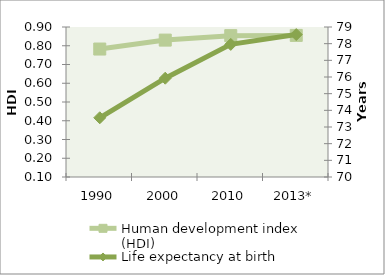
| Category | Human development index (HDI) |
|---|---|
| 1990 | 0.782 |
| 2000 | 0.83 |
| 2010 | 0.854 |
| 2013* | 0.855 |